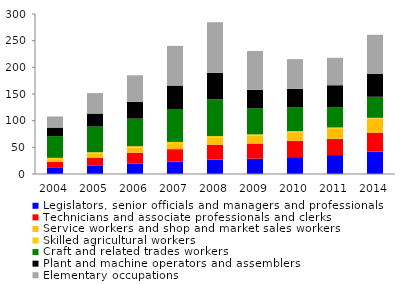
| Category | Legislators, senior officials and managers and professionals  | Technicians and associate professionals and clerks | Service workers and shop and market sales workers
 | Skilled agricultural workers | Craft and related trades workers  | Plant and machine operators and assemblers  | Elementary occupations  |
|---|---|---|---|---|---|---|---|
| 2004.0 | 11.465 | 11.139 | 5.038 | 2.71 | 40.653 | 16.059 | 20.92 |
| 2005.0 | 15.309 | 15.48 | 7.216 | 2.905 | 48.048 | 24.402 | 38.376 |
| 2006.0 | 19.785 | 20.204 | 9.514 | 2.539 | 51.854 | 31.26 | 49.919 |
| 2007.0 | 23.099 | 23.51 | 11.092 | 2.439 | 61.716 | 43.996 | 74.39 |
| 2008.0 | 27.045 | 28.012 | 13.483 | 2.593 | 68.775 | 49.738 | 94.905 |
| 2009.0 | 28.714 | 28.55 | 14.624 | 2.429 | 48.601 | 34.906 | 72.885 |
| 2010.0 | 31.6 | 30.792 | 15.977 | 2.016 | 45.071 | 34.227 | 55.684 |
| 2011.0 | 35.433 | 30.448 | 19.756 | 1.626 | 38.192 | 40.999 | 51.408 |
| 2014.0 | 42.078 | 35.573 | 26.154 | 1.54 | 39.44 | 42.733 | 73.481 |